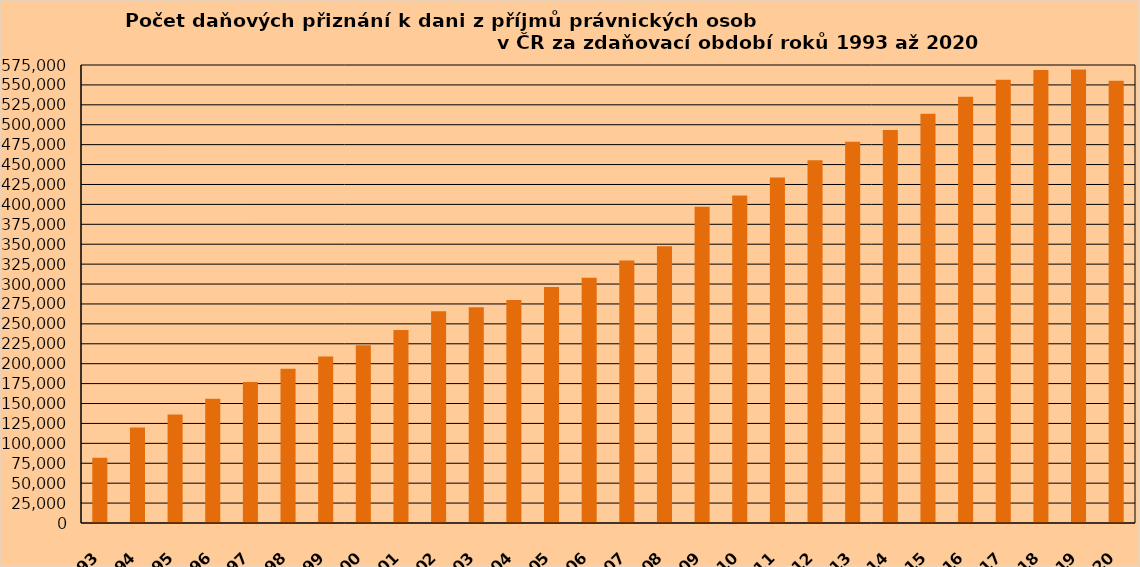
| Category | 81 950 |
|---|---|
| 1993 | 81950 |
| 1994 | 119831 |
| 1995 | 136334 |
| 1996 | 156029 |
| 1997 | 176934 |
| 1998 | 193797 |
| 1999 | 209106 |
| 2000 | 223307 |
| 2001 | 242164 |
| 2002 | 265813 |
| 2003 | 270968 |
| 2004 | 279964 |
| 2005 | 296271 |
| 2006 | 307986 |
| 2007 | 329481 |
| 2008 | 347457 |
| 2009 | 396925 |
| 2010 | 411060 |
| *2011 | 433818 |
| 2012 | 455482 |
| 2013 | 478527 |
| 2014 | 493300 |
| 2015 | 513784 |
| 2016 | 534990 |
| 2017 | 556470 |
| 2018 | 568572 |
| 2019 | 569470 |
| 2020 | 555351 |